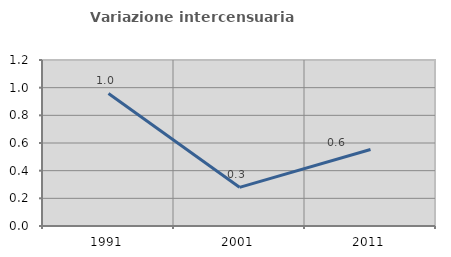
| Category | Variazione intercensuaria annua |
|---|---|
| 1991.0 | 0.958 |
| 2001.0 | 0.279 |
| 2011.0 | 0.553 |